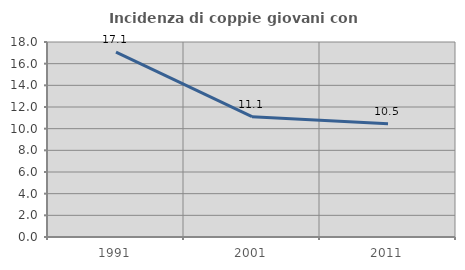
| Category | Incidenza di coppie giovani con figli |
|---|---|
| 1991.0 | 17.056 |
| 2001.0 | 11.111 |
| 2011.0 | 10.455 |